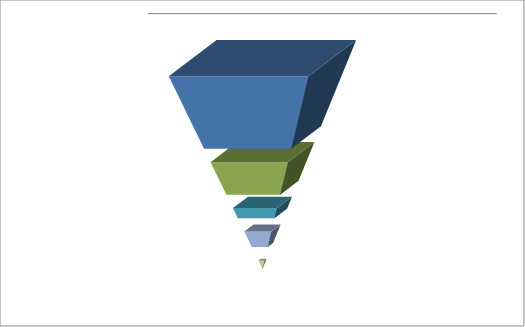
| Category | Prospecting | Spacer | Qualification | Proposal | Negotiation | Closed Won |
|---|---|---|---|---|---|---|
| Amount | 216 | 40 | 97 | 30 | 46 | 25 |